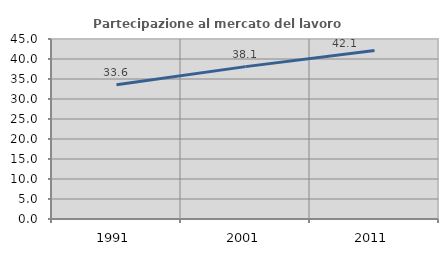
| Category | Partecipazione al mercato del lavoro  femminile |
|---|---|
| 1991.0 | 33.582 |
| 2001.0 | 38.095 |
| 2011.0 | 42.125 |